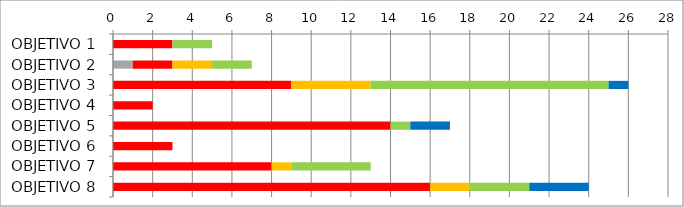
| Category | Series 0 | Series 1 | Series 2 | Series 3 | Series 4 | Series 5 |
|---|---|---|---|---|---|---|
| OBJETIVO 1 | 0 | 0 | 3 | 0 | 2 | 0 |
| OBJETIVO 2 | 0 | 1 | 2 | 2 | 2 | 0 |
| OBJETIVO 3 | 0 | 0 | 9 | 4 | 12 | 1 |
| OBJETIVO 4 | 0 | 0 | 2 | 0 | 0 | 0 |
| OBJETIVO 5 | 0 | 0 | 14 | 0 | 1 | 2 |
| OBJETIVO 6 | 0 | 0 | 3 | 0 | 0 | 0 |
| OBJETIVO 7 | 0 | 0 | 8 | 1 | 4 | 0 |
| OBJETIVO 8 | 0 | 0 | 16 | 2 | 3 | 3 |